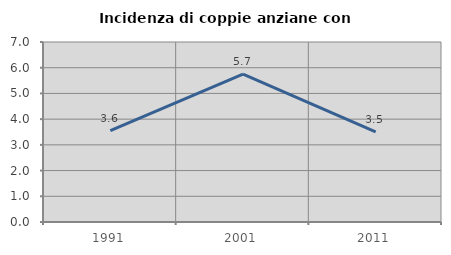
| Category | Incidenza di coppie anziane con figli |
|---|---|
| 1991.0 | 3.55 |
| 2001.0 | 5.747 |
| 2011.0 | 3.509 |